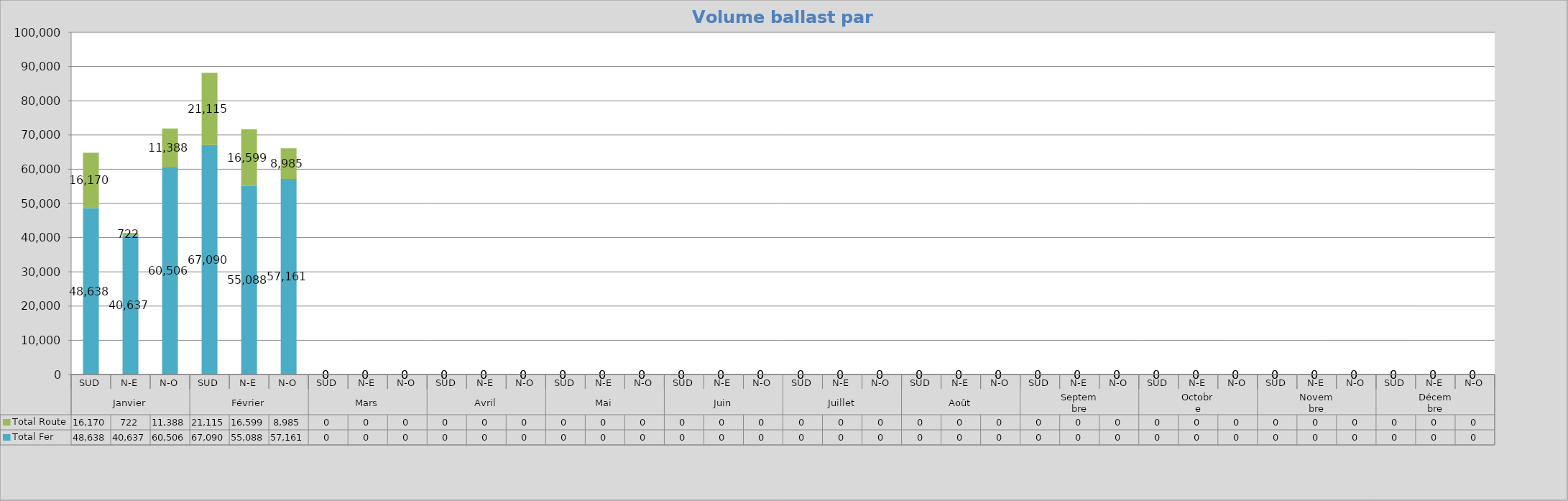
| Category | Total Fer | Total Route  |
|---|---|---|
| 0 | 48638 | 16170 |
| 1 | 40637 | 722 |
| 2 | 60506 | 11388 |
| 3 | 67090 | 21115 |
| 4 | 55088 | 16599 |
| 5 | 57161 | 8985 |
| 6 | 0 | 0 |
| 7 | 0 | 0 |
| 8 | 0 | 0 |
| 9 | 0 | 0 |
| 10 | 0 | 0 |
| 11 | 0 | 0 |
| 12 | 0 | 0 |
| 13 | 0 | 0 |
| 14 | 0 | 0 |
| 15 | 0 | 0 |
| 16 | 0 | 0 |
| 17 | 0 | 0 |
| 18 | 0 | 0 |
| 19 | 0 | 0 |
| 20 | 0 | 0 |
| 21 | 0 | 0 |
| 22 | 0 | 0 |
| 23 | 0 | 0 |
| 24 | 0 | 0 |
| 25 | 0 | 0 |
| 26 | 0 | 0 |
| 27 | 0 | 0 |
| 28 | 0 | 0 |
| 29 | 0 | 0 |
| 30 | 0 | 0 |
| 31 | 0 | 0 |
| 32 | 0 | 0 |
| 33 | 0 | 0 |
| 34 | 0 | 0 |
| 35 | 0 | 0 |